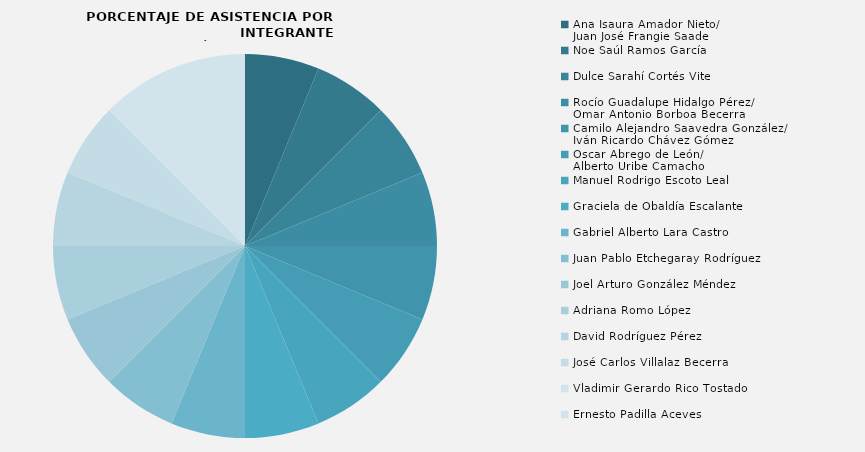
| Category | Series 0 |
|---|---|
| Ana Isaura Amador Nieto/
Juan José Frangie Saade | 100 |
| Noe Saúl Ramos García  | 100 |
| Dulce Sarahí Cortés Vite | 100 |
| Rocío Guadalupe Hidalgo Pérez/
Omar Antonio Borboa Becerra | 100 |
| Camilo Alejandro Saavedra González/
Iván Ricardo Chávez Gómez | 100 |
| Oscar Abrego de León/
Alberto Uribe Camacho | 100 |
| Manuel Rodrigo Escoto Leal | 100 |
| Graciela de Obaldía Escalante | 100 |
| Gabriel Alberto Lara Castro | 100 |
| Juan Pablo Etchegaray Rodríguez | 100 |
| Joel Arturo González Méndez  | 100 |
| Adriana Romo López | 100 |
| David Rodríguez Pérez | 100 |
| José Carlos Villalaz Becerra  | 100 |
| Vladimir Gerardo Rico Tostado  | 100 |
| Ernesto Padilla Aceves  | 100 |